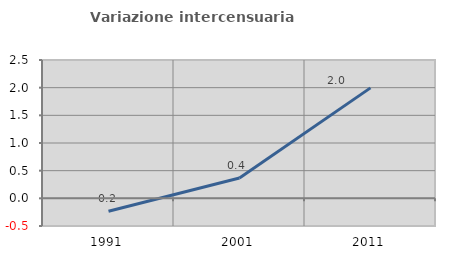
| Category | Variazione intercensuaria annua |
|---|---|
| 1991.0 | -0.233 |
| 2001.0 | 0.367 |
| 2011.0 | 1.996 |